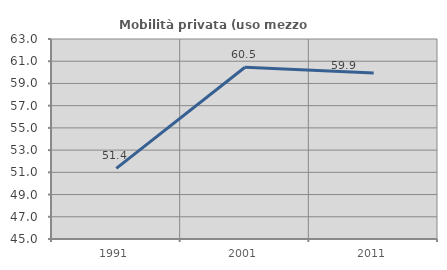
| Category | Mobilità privata (uso mezzo privato) |
|---|---|
| 1991.0 | 51.351 |
| 2001.0 | 60.458 |
| 2011.0 | 59.947 |